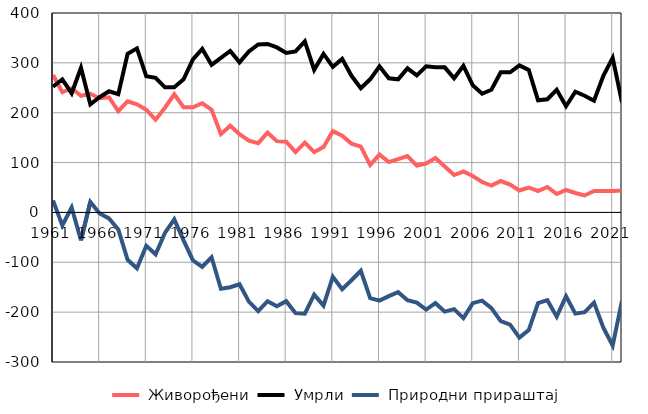
| Category |  Живорођени |  Умрли |  Природни прираштај |
|---|---|---|---|
| 1961.0 | 276 | 252 | 24 |
| 1962.0 | 241 | 267 | -26 |
| 1963.0 | 249 | 239 | 10 |
| 1964.0 | 234 | 290 | -56 |
| 1965.0 | 238 | 217 | 21 |
| 1966.0 | 229 | 231 | -2 |
| 1967.0 | 231 | 243 | -12 |
| 1968.0 | 203 | 237 | -34 |
| 1969.0 | 223 | 318 | -95 |
| 1970.0 | 217 | 329 | -112 |
| 1971.0 | 206 | 273 | -67 |
| 1972.0 | 186 | 270 | -84 |
| 1973.0 | 210 | 251 | -41 |
| 1974.0 | 237 | 251 | -14 |
| 1975.0 | 211 | 267 | -56 |
| 1976.0 | 211 | 307 | -96 |
| 1977.0 | 219 | 328 | -109 |
| 1978.0 | 206 | 296 | -90 |
| 1979.0 | 157 | 310 | -153 |
| 1980.0 | 174 | 324 | -150 |
| 1981.0 | 157 | 301 | -144 |
| 1982.0 | 144 | 323 | -179 |
| 1983.0 | 139 | 337 | -198 |
| 1984.0 | 160 | 338 | -178 |
| 1985.0 | 143 | 331 | -188 |
| 1986.0 | 142 | 320 | -178 |
| 1987.0 | 121 | 323 | -202 |
| 1988.0 | 140 | 343 | -203 |
| 1989.0 | 121 | 286 | -165 |
| 1990.0 | 131 | 318 | -187 |
| 1991.0 | 163 | 292 | -129 |
| 1992.0 | 154 | 308 | -154 |
| 1993.0 | 138 | 274 | -136 |
| 1994.0 | 132 | 249 | -117 |
| 1995.0 | 95 | 267 | -172 |
| 1996.0 | 116 | 293 | -177 |
| 1997.0 | 101 | 269 | -168 |
| 1998.0 | 107 | 267 | -160 |
| 1999.0 | 113 | 289 | -176 |
| 2000.0 | 94 | 275 | -181 |
| 2001.0 | 98 | 293 | -195 |
| 2002.0 | 109 | 291 | -182 |
| 2003.0 | 92 | 291 | -199 |
| 2004.0 | 75 | 269 | -194 |
| 2005.0 | 82 | 294 | -212 |
| 2006.0 | 73 | 255 | -182 |
| 2007.0 | 61 | 238 | -177 |
| 2008.0 | 54 | 246 | -192 |
| 2009.0 | 63 | 281 | -218 |
| 2010.0 | 56 | 281 | -225 |
| 2011.0 | 44 | 295 | -251 |
| 2012.0 | 50 | 286 | -236 |
| 2013.0 | 43 | 225 | -182 |
| 2014.0 | 51 | 227 | -176 |
| 2015.0 | 37 | 246 | -209 |
| 2016.0 | 45 | 213 | -168 |
| 2017.0 | 39 | 242 | -203 |
| 2018.0 | 34 | 234 | -200 |
| 2019.0 | 43 | 224 | -181 |
| 2020.0 | 43 | 274 | -231 |
| 2021.0 | 43 | 310 | -267 |
| 2022.0 | 44 | 221 | -177 |